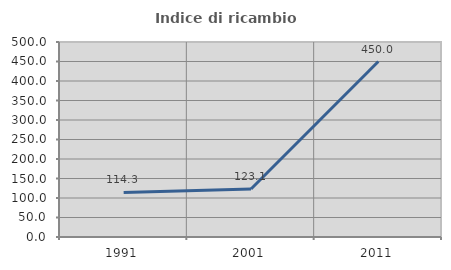
| Category | Indice di ricambio occupazionale  |
|---|---|
| 1991.0 | 114.286 |
| 2001.0 | 123.077 |
| 2011.0 | 450 |